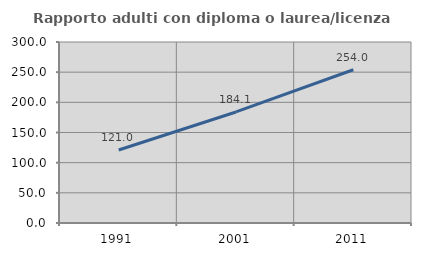
| Category | Rapporto adulti con diploma o laurea/licenza media  |
|---|---|
| 1991.0 | 120.972 |
| 2001.0 | 184.059 |
| 2011.0 | 253.961 |